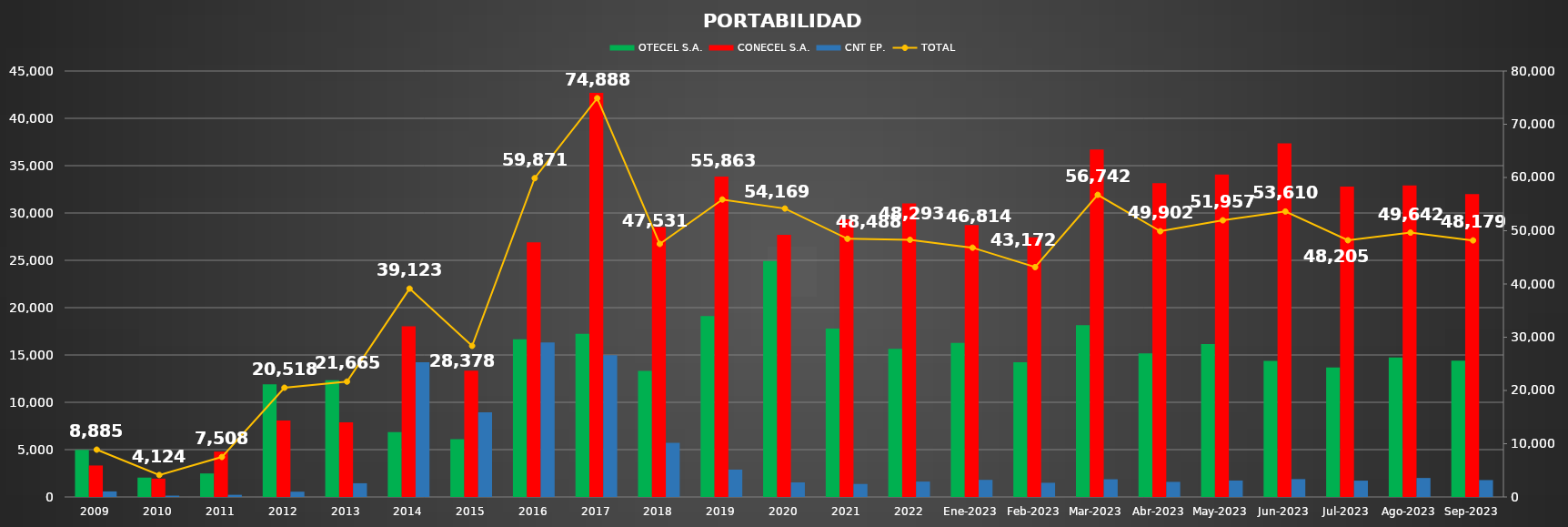
| Category | OTECEL S.A. | CONECEL S.A. | CNT EP. |
|---|---|---|---|
| 2009 | 4973 | 3324 | 588 |
| 2010 | 2045 | 1939 | 140 |
| 2011 | 2484 | 4796 | 228 |
| 2012 | 11894 | 8067 | 557 |
| 2013 | 12323 | 7893 | 1449 |
| 2014 | 6853 | 18039 | 14231 |
| 2015 | 6105 | 13334 | 8939 |
| 2016 | 16653 | 26907 | 16311 |
| 2017 | 17228 | 42694 | 14966 |
| 2018 | 13309 | 28504 | 5718 |
| 2019 | 19116 | 33857 | 2890 |
| 2020 | 24933 | 27700 | 1536 |
| 2021 | 17795 | 29321 | 1372 |
| 2022 | 15655 | 31012 | 1626 |
| Ene-2023 | 16278 | 28730 | 1806 |
| Feb-2023 | 14237 | 27438 | 1497 |
| Mar-2023 | 18159 | 36713 | 1870 |
| Abr-2023 | 15167 | 33140 | 1595 |
| May-2023 | 16147 | 34074 | 1736 |
| Jun-2023 | 14369 | 37353 | 1888 |
| Jul-2023 | 13685 | 32795 | 1725 |
| Ago-2023 | 14739 | 32898 | 2005 |
| Sep-2023 | 14396 | 31999 | 1784 |